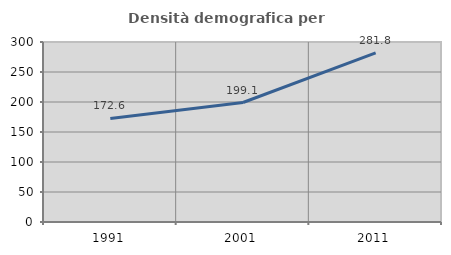
| Category | Densità demografica |
|---|---|
| 1991.0 | 172.647 |
| 2001.0 | 199.121 |
| 2011.0 | 281.844 |